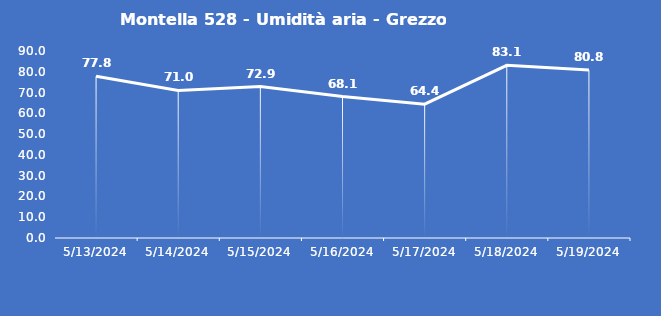
| Category | Montella 528 - Umidità aria - Grezzo (%) |
|---|---|
| 5/13/24 | 77.8 |
| 5/14/24 | 71 |
| 5/15/24 | 72.9 |
| 5/16/24 | 68.1 |
| 5/17/24 | 64.4 |
| 5/18/24 | 83.1 |
| 5/19/24 | 80.8 |